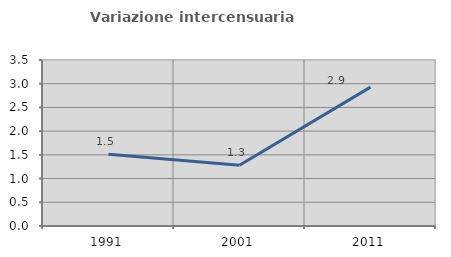
| Category | Variazione intercensuaria annua |
|---|---|
| 1991.0 | 1.512 |
| 2001.0 | 1.279 |
| 2011.0 | 2.928 |